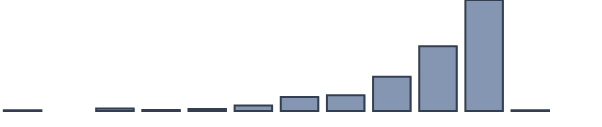
| Category | Series 0 |
|---|---|
| 0 | 0.2 |
| 1 | 0 |
| 2 | 0.8 |
| 3 | 0.3 |
| 4 | 0.6 |
| 5 | 1.7 |
| 6 | 4.4 |
| 7 | 5 |
| 8 | 10.8 |
| 9 | 20.4 |
| 10 | 55.7 |
| 11 | 0.2 |
| 12 | 0 |